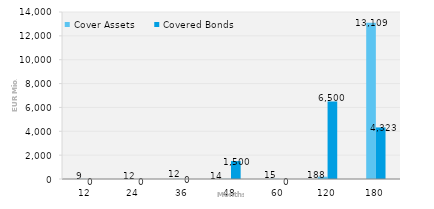
| Category | Cover Assets | Covered Bonds |
|---|---|---|
| 12.0 | 8.988 | 0 |
| 24.0 | 11.674 | 0 |
| 36.0 | 12.237 | 0 |
| 48.0 | 14.382 | 1500 |
| 60.0 | 15.16 | 0 |
| 120.0 | 188.279 | 6500 |
| 180.0 | 13109.279 | 4323 |